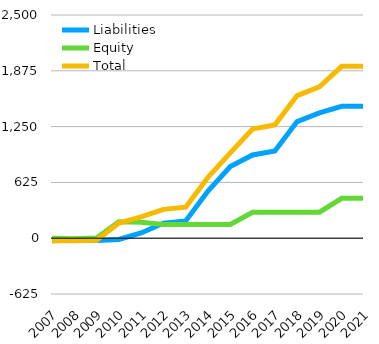
| Category | Liabilities  | Equity  | Total  |
|---|---|---|---|
| 2007 | -27.786 | 0 | -27.786 |
| 2008 | -20.714 | -6.786 | -27.5 |
| 2009 | -24.357 | 1.714 | -22.643 |
| 2010 | -13.857 | 182.929 | 169.071 |
| 2011 | 58.929 | 179.357 | 238.286 |
| 2012 | 168.929 | 154.357 | 323.286 |
| 2013 | 192.929 | 154.357 | 347.286 |
| 2014 | 527.929 | 154.357 | 682.286 |
| 2015 | 801.929 | 154.357 | 956.286 |
| 2016 | 931.929 | 291.357 | 1223.286 |
| 2017 | 977.929 | 291.357 | 1269.286 |
| 2018 | 1305.929 | 291.357 | 1597.286 |
| 2019 | 1402.929 | 291.357 | 1694.286 |
| 2020 | 1477.929 | 447.357 | 1925.286 |
| 2021 | 1478.929 | 447.357 | 1926.286 |